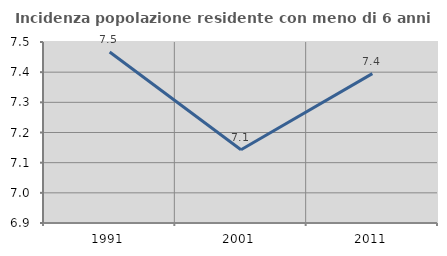
| Category | Incidenza popolazione residente con meno di 6 anni |
|---|---|
| 1991.0 | 7.467 |
| 2001.0 | 7.143 |
| 2011.0 | 7.395 |